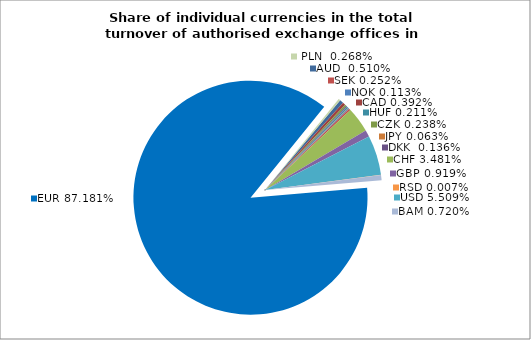
| Category | AUD |
|---|---|
| 0 | 0.005 |
| 1 | 0.004 |
| 2 | 0.002 |
| 3 | 0.001 |
| 4 | 0.002 |
| 5 | 0.001 |
| 6 | 0.001 |
| 7 | 0.003 |
| 8 | 0.035 |
| 9 | 0.009 |
| 10 | 0.055 |
| 11 | 0 |
| 12 | 0.007 |
| 13 | 0.872 |
| 14 | 0.003 |